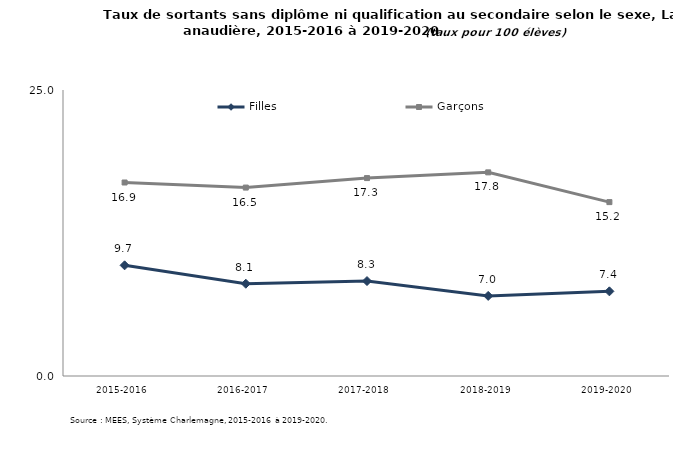
| Category | Filles | Garçons |
|---|---|---|
| 2015-2016 | 9.673 | 16.914 |
| 2016-2017 | 8.065 | 16.471 |
| 2017-2018 | 8.3 | 17.3 |
| 2018-2019 | 7 | 17.8 |
| 2019-2020 | 7.4 | 15.2 |